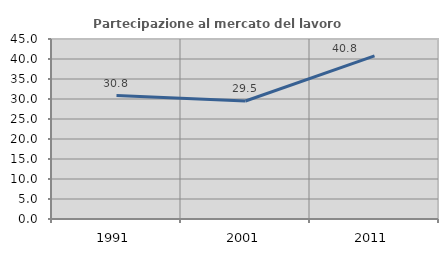
| Category | Partecipazione al mercato del lavoro  femminile |
|---|---|
| 1991.0 | 30.846 |
| 2001.0 | 29.508 |
| 2011.0 | 40.773 |